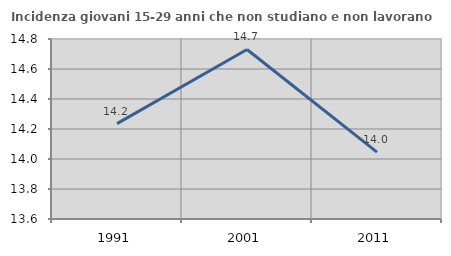
| Category | Incidenza giovani 15-29 anni che non studiano e non lavorano  |
|---|---|
| 1991.0 | 14.236 |
| 2001.0 | 14.73 |
| 2011.0 | 14.046 |